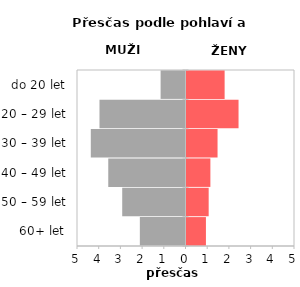
| Category | Přesčas |
|---|---|
| 60+ let | 0.895 |
| 50 – 59 let | 1.022 |
| 40 – 49 let | 1.1 |
| 30 – 39 let | 1.431 |
| 20 – 29 let | 2.398 |
| do 20 let | 1.757 |